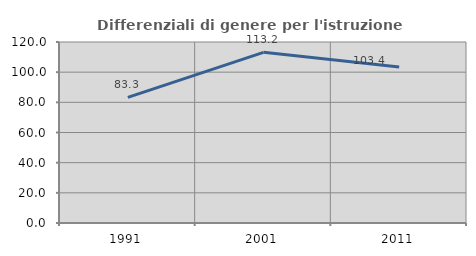
| Category | Differenziali di genere per l'istruzione superiore |
|---|---|
| 1991.0 | 83.284 |
| 2001.0 | 113.158 |
| 2011.0 | 103.387 |